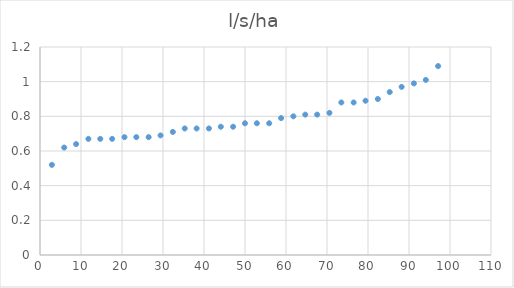
| Category | Series 0 |
|---|---|
| 2.9 | 0.52 |
| 5.9 | 0.62 |
| 8.8 | 0.64 |
| 11.8 | 0.67 |
| 14.7 | 0.67 |
| 17.6 | 0.67 |
| 20.6 | 0.68 |
| 23.5 | 0.68 |
| 26.5 | 0.68 |
| 29.4 | 0.69 |
| 32.4 | 0.71 |
| 35.3 | 0.73 |
| 38.2 | 0.73 |
| 41.2 | 0.73 |
| 44.1 | 0.74 |
| 47.1 | 0.74 |
| 50.0 | 0.76 |
| 52.9 | 0.76 |
| 55.9 | 0.76 |
| 58.8 | 0.79 |
| 61.8 | 0.8 |
| 64.7 | 0.81 |
| 67.6 | 0.81 |
| 70.6 | 0.82 |
| 73.5 | 0.88 |
| 76.5 | 0.88 |
| 79.4 | 0.89 |
| 82.4 | 0.9 |
| 85.3 | 0.94 |
| 88.2 | 0.97 |
| 91.2 | 0.99 |
| 94.1 | 1.01 |
| 97.1 | 1.09 |